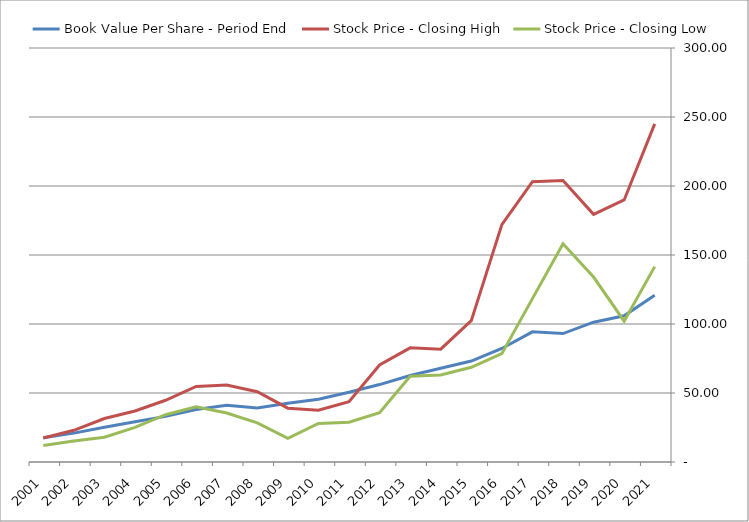
| Category | Book Value Per Share - Period End | Stock Price - Closing High | Stock Price - Closing Low |
|---|---|---|---|
| 2021.0 | 120.89 | 245 | 141.57 |
| 2020.0 | 105.931 | 189.9 | 102.02 |
| 2019.0 | 101.303 | 179.48 | 134.04 |
| 2018.0 | 93.078 | 204 | 158.15 |
| 2017.0 | 94.293 | 203.1 | 118.39 |
| 2016.0 | 82.283 | 172.01 | 78.54 |
| 2015.0 | 73.172 | 102.41 | 68.62 |
| 2014.0 | 67.991 | 81.77 | 63.09 |
| 2013.0 | 62.672 | 82.73 | 62.14 |
| 2012.0 | 56.103 | 70.31 | 35.8 |
| 2011.0 | 50.535 | 43.67 | 28.79 |
| 2010.0 | 45.531 | 37.54 | 27.95 |
| 2009.0 | 42.559 | 39 | 17.14 |
| 2008.0 | 39.183 | 50.88 | 28.35 |
| 2007.0 | 41.171 | 55.73 | 35.5 |
| 2006.0 | 37.999 | 54.76 | 40.02 |
| 2005.0 | 33.065 | 44.75 | 34.27 |
| 2004.0 | 29.225 | 37 | 25.1 |
| 2003.0 | 25.236 | 31.5 | 18 |
| 2002.0 | 20.935 | 22.96 | 15.24 |
| 2001.0 | 17.594 | 17.44 | 12.01 |